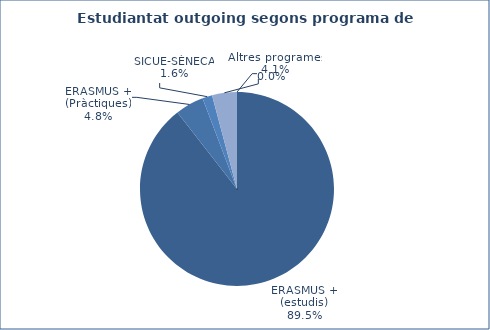
| Category | Est outgoing |
|---|---|
| ERASMUS + (estudis) | 1037 |
| ERASMUS + (Pràctiques) | 55 |
| SICUE-SÈNECA | 19 |
| Altres programes | 48 |